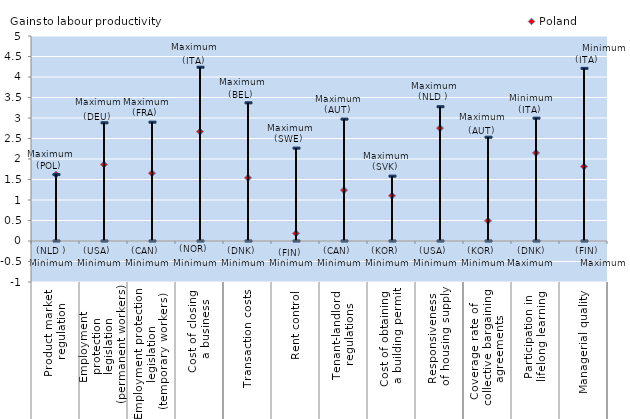
| Category | Poland |  Maximum |  Minimum | max2 | min2 |
|---|---|---|---|---|---|
| 0 | 1.62 | 1.62 | 0 | 1.614 | 0.006 |
| 1 | 1.863 | 2.882 | 0 | 2.876 | 0.006 |
| 2 | 1.653 | 2.899 | 0 | 2.893 | 0.006 |
| 3 | 2.667 | 4.239 | 0 | 4.233 | 0.006 |
| 4 | 1.539 | 3.37 | 0 | 3.364 | 0.006 |
| 5 | 0.187 | 2.265 | 0 | 2.259 | 0.006 |
| 6 | 1.241 | 2.973 | 0 | 2.967 | 0.006 |
| 7 | 1.104 | 1.582 | 0 | 1.576 | 0.006 |
| 8 | 2.753 | 3.274 | 0 | 3.268 | 0.006 |
| 9 | 0.492 | 2.532 | 0 | 2.526 | 0.006 |
| 10 | 2.147 | 2.996 | 0 | 2.99 | 0.006 |
| 11 | 1.815 | 4.21 | 0 | 4.204 | 0.006 |